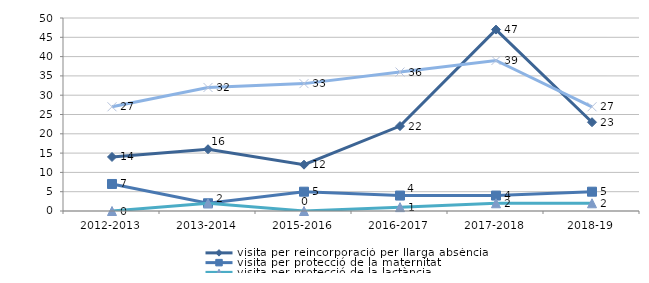
| Category | visita per reincorporació per llarga absència | visita per protecció de la maternitat | visita per protecció de la lactància | visita per motius de salut |
|---|---|---|---|---|
| 2012-2013 | 14 | 7 | 0 | 27 |
| 2013-2014 | 16 | 2 | 2 | 32 |
| 2015-2016 | 12 | 5 | 0 | 33 |
| 2016-2017 | 22 | 4 | 1 | 36 |
| 2017-2018 | 47 | 4 | 2 | 39 |
| 2018-19 | 23 | 5 | 2 | 27 |